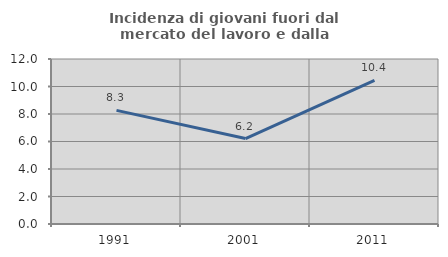
| Category | Incidenza di giovani fuori dal mercato del lavoro e dalla formazione  |
|---|---|
| 1991.0 | 8.264 |
| 2001.0 | 6.218 |
| 2011.0 | 10.44 |